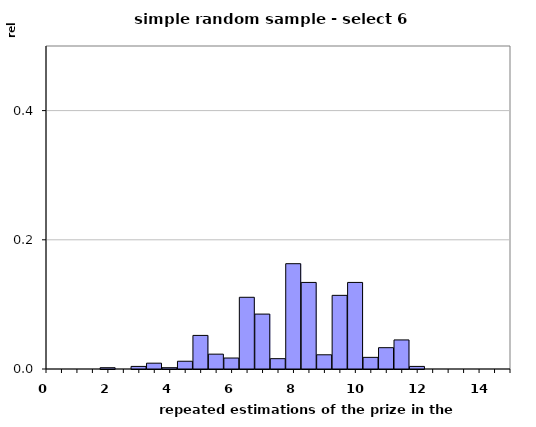
| Category | Method 1 |
|---|---|
| 0.0 | 0 |
| 0.5 | 0 |
| 1.0 | 0 |
| 1.5 | 0 |
| 2.0 | 0.002 |
| 2.5 | 0 |
| 3.0 | 0.004 |
| 3.5 | 0.009 |
| 4.0 | 0.002 |
| 4.5 | 0.012 |
| 5.0 | 0.052 |
| 5.5 | 0.023 |
| 6.0 | 0.017 |
| 6.5 | 0.111 |
| 7.0 | 0.085 |
| 7.5 | 0.016 |
| 8.0 | 0.163 |
| 8.5 | 0.134 |
| 9.0 | 0.022 |
| 9.5 | 0.114 |
| 10.0 | 0.134 |
| 10.5 | 0.018 |
| 11.0 | 0.033 |
| 11.5 | 0.045 |
| 12.0 | 0.004 |
| 12.5 | 0 |
| 13.0 | 0 |
| 13.5 | 0 |
| 14.0 | 0 |
| 14.5 | 0 |
| 15.0 | 0 |